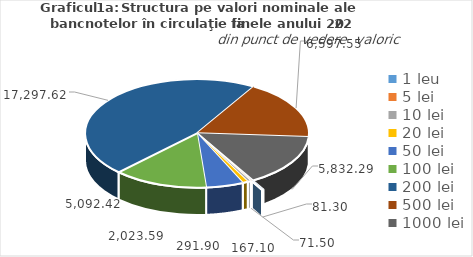
| Category | Series 0 |
|---|---|
| 1 leu | 81.3 |
| 5 lei | 71.5 |
| 10 lei | 167.1 |
| 20 lei | 291.9 |
| 50 lei | 2023.59 |
| 100 lei | 5092.42 |
| 200 lei | 17297.62 |
| 500 lei | 6597.55 |
| 1000 lei | 5832.29 |